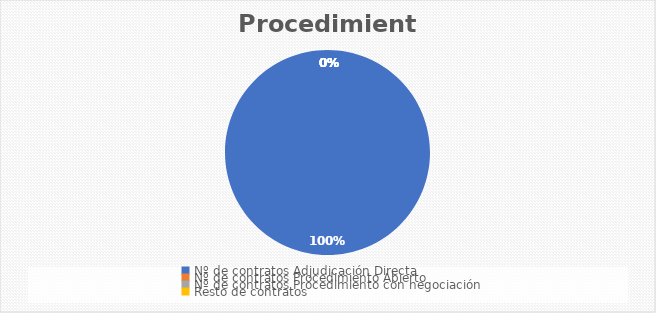
| Category | Series 0 |
|---|---|
| Nº de contratos Adjudicación Directa | 15609 |
| Nº de contratos Procedimiento Abierto | 0 |
| Nº de contratos Procedimiento con negociación | 0 |
| Resto de contratos | 0 |